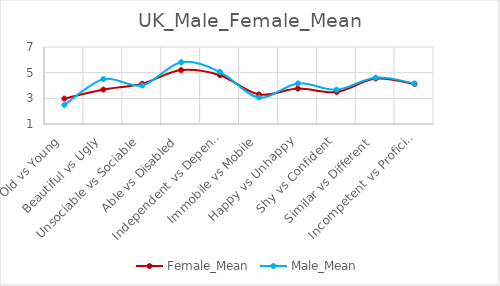
| Category | Female_Mean | Male_Mean |
|---|---|---|
| Old vs Young | 2.98 | 2.492 |
|  Beautiful vs Ugly | 3.68 | 4.492 |
| Unsociable vs Sociable | 4.14 | 4 |
| Able vs Disabled | 5.2 | 5.82 |
| Independent vs Dependent | 4.8 | 5.049 |
| Immobile vs Mobile | 3.3 | 3.066 |
| Happy vs Unhappy | 3.76 | 4.164 |
| Shy vs Confident | 3.5 | 3.672 |
| Similar vs Different | 4.54 | 4.607 |
| Incompetent vs Proficient | 4.12 | 4.164 |